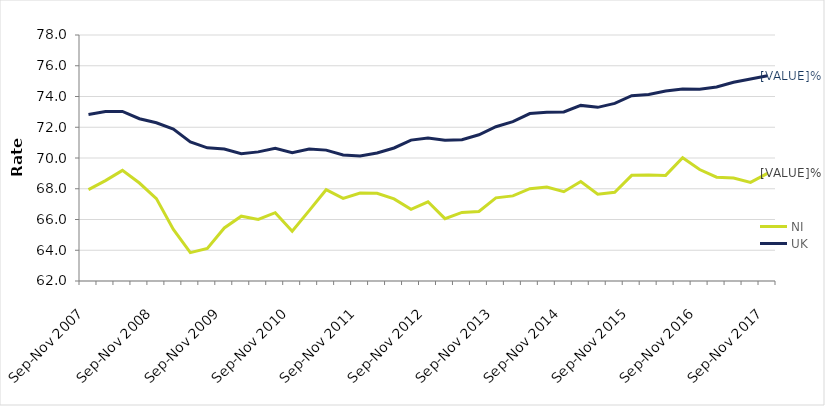
| Category | NI | UK |
|---|---|---|
| Sep-Nov 2007 | 67.944 | 72.83 |
| Dec-Feb 2008 | 68.532 | 73.021 |
| Mar-May 2008 | 69.193 | 73.027 |
| Jun-Aug 2008 | 68.372 | 72.555 |
| Sep-Nov 2008 | 67.357 | 72.291 |
| Dec-Feb 2009 | 65.352 | 71.882 |
| Mar-May 2009 | 63.847 | 71.049 |
| Jun-Aug 2009 | 64.122 | 70.661 |
| Sep-Nov 2009 | 65.451 | 70.579 |
| Dec-Feb 2010 | 66.217 | 70.28 |
| Mar-May 2010 | 66.009 | 70.398 |
| Jun-Aug 2010 | 66.442 | 70.639 |
| Sep-Nov 2010 | 65.232 | 70.339 |
| Dec-Feb 2011 | 66.574 | 70.586 |
| Mar-May 2011 | 67.937 | 70.512 |
| Jun-Aug 2011 | 67.373 | 70.194 |
| Sep-Nov 2011 | 67.718 | 70.136 |
| Dec-Feb 2012 | 67.706 | 70.328 |
| Mar-May 2012 | 67.338 | 70.652 |
| Jun-Aug 2012 | 66.659 | 71.164 |
| Sep-Nov 2012 | 67.152 | 71.296 |
| Dec-Feb 2013 | 66.053 | 71.159 |
| Mar-May 2013 | 66.461 | 71.191 |
| Jun-Aug 2013 | 66.519 | 71.509 |
| Sep-Nov 2013 | 67.407 | 72.036 |
| Dec-Feb 2014 | 67.537 | 72.368 |
| Mar-May 2014 | 68.005 | 72.888 |
| Jun-Aug 2014 | 68.107 | 72.974 |
| Sep-Nov 2014 | 67.807 | 72.992 |
| Dec-Feb 2015 | 68.476 | 73.421 |
| Mar-May 2015 | 67.651 | 73.294 |
| Jun-Aug 2015 | 67.772 | 73.555 |
| Sep-Nov 2015 | 68.871 | 74.056 |
| Dec-Feb 2016 | 68.891 | 74.132 |
| Mar-May 2016 | 68.87 | 74.361 |
| Jun-Aug 2016 | 70.014 | 74.486 |
| Sep-Nov 2016 | 69.25 | 74.468 |
| Dec-Feb 2017 | 68.753 | 74.614 |
| Mar-May 2017 | 68.697 | 74.929 |
| Jun-Aug 2017 | 68.413 | 75.14 |
| Sep-Nov 2017 | 69 | 75.349 |